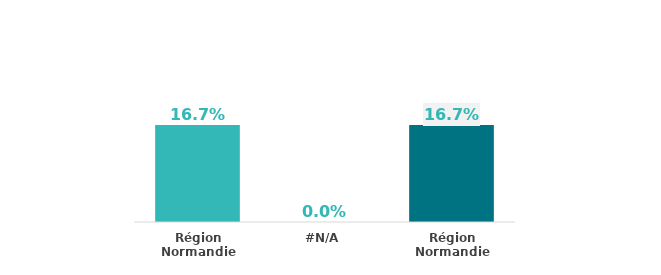
| Category | Series 0 |
|---|---|
| Région Normandie | 0.167 |
| #N/A | 0 |
| Région Normandie | 0.167 |